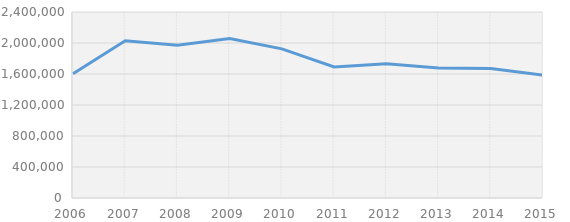
| Category | Series 0 |
|---|---|
| 2006.0 | 1601978 |
| 2007.0 | 2029032 |
| 2008.0 | 1970725 |
| 2009.0 | 2057660 |
| 2010.0 | 1924540 |
| 2011.0 | 1690706 |
| 2012.0 | 1731179 |
| 2013.0 | 1677372 |
| 2014.0 | 1672117 |
| 2015.0 | 1585402 |